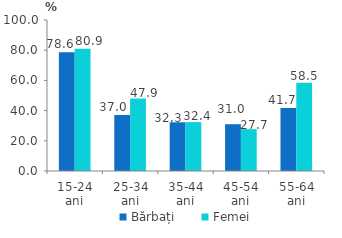
| Category | Bărbați | Femei |
|---|---|---|
| 15-24 ani | 78.647 | 80.901 |
| 25-34 ani | 37.02 | 47.944 |
| 35-44 ani | 32.269 | 32.37 |
| 45-54 ani | 30.989 | 27.714 |
| 55-64 ani | 41.654 | 58.469 |